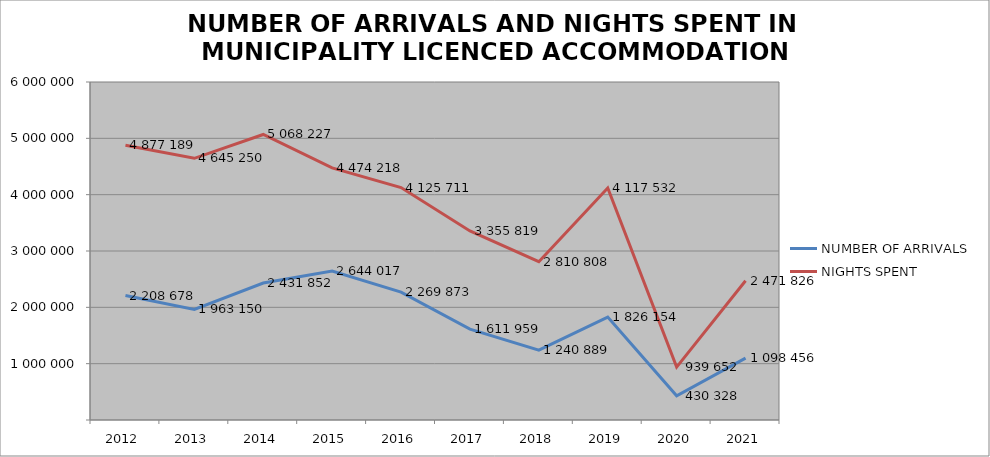
| Category | NUMBER OF ARRIVALS | NIGHTS SPENT |
|---|---|---|
| 2012 | 2208678 | 4877189 |
| 2013 | 1963150 | 4645250 |
| 2014 | 2431852 | 5068227 |
| 2015 | 2644017 | 4474218 |
| 2016 | 2269873 | 4125711 |
| 2017 | 1611959 | 3355819 |
| 2018 | 1240889 | 2810808 |
| 2019 | 1826154 | 4117532 |
| 2020 | 430328 | 939652 |
| 2021 | 1098456 | 2471826 |